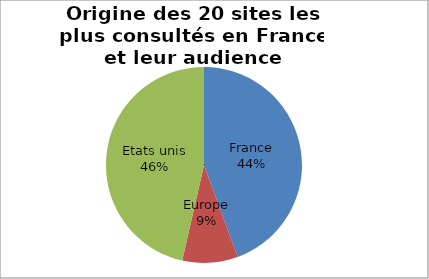
| Category | Series 0 |
|---|---|
| 0 | 0.444 |
| 1 | 0.092 |
| 2 | 0.464 |